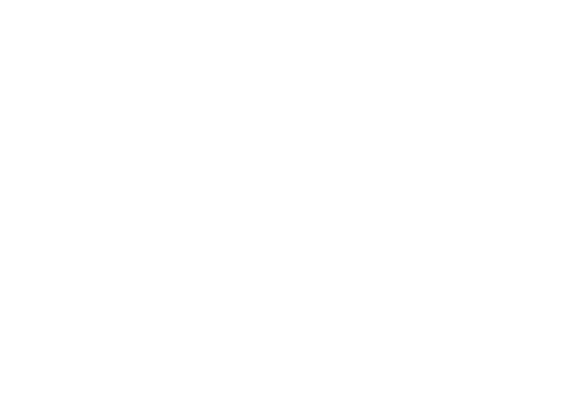
| Category | Total |
|---|---|
| NO | 11.905 |
| SI | 88.095 |